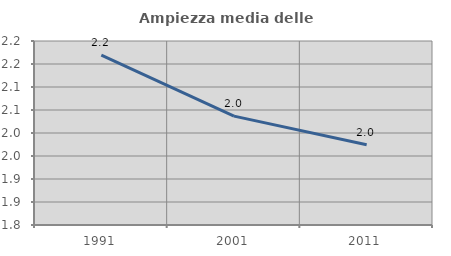
| Category | Ampiezza media delle famiglie |
|---|---|
| 1991.0 | 2.169 |
| 2001.0 | 2.037 |
| 2011.0 | 1.974 |